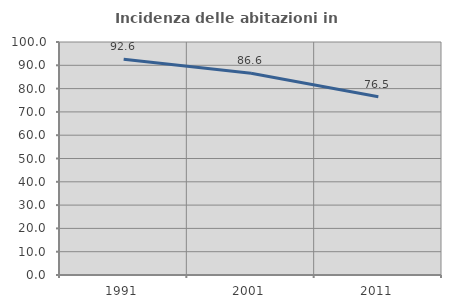
| Category | Incidenza delle abitazioni in proprietà  |
|---|---|
| 1991.0 | 92.632 |
| 2001.0 | 86.628 |
| 2011.0 | 76.536 |